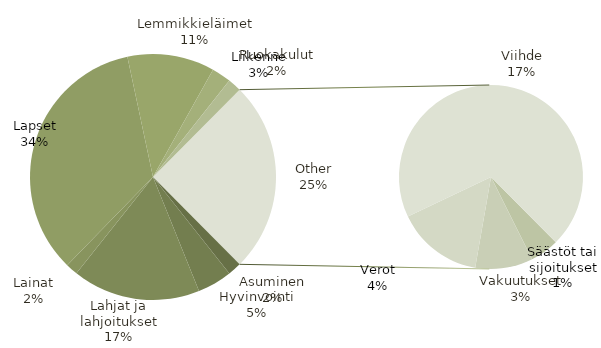
| Category | Summa |
|---|---|
| Asuminen | 140 |
| Hyvinvointi | 358 |
| Lahjat ja lahjoitukset | 1320 |
| Lainat | 125 |
| Lapset | 2702 |
| Lemmikkieläimet | 900 |
| Liikenne | 200 |
| Ruokakulut | 140 |
| Säästöt tai sijoitukset | 100 |
| Vakuutukset | 200 |
| Verot | 300 |
| Viihde | 1375 |